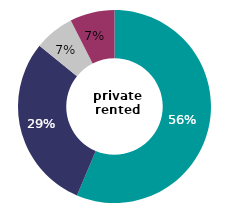
| Category | private 
rented |
|---|---|
| very satisfied | 56.364 |
| fairly satisfied | 29.464 |
| neither satisfied nor dissatisfied | 6.694 |
| all dissatisfied | 7.479 |